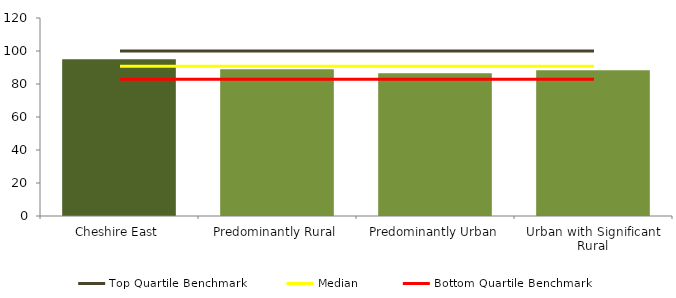
| Category | Series 0 |
|---|---|
| Cheshire East | 95 |
| Predominantly Rural | 88.907 |
| Predominantly Urban | 86.517 |
| Urban with Significant Rural | 88.333 |